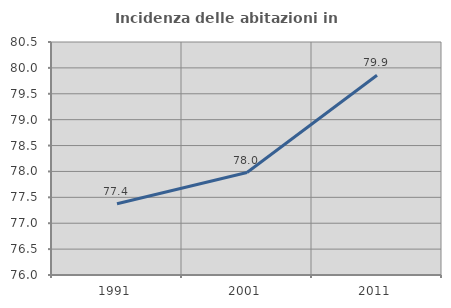
| Category | Incidenza delle abitazioni in proprietà  |
|---|---|
| 1991.0 | 77.377 |
| 2001.0 | 77.979 |
| 2011.0 | 79.859 |